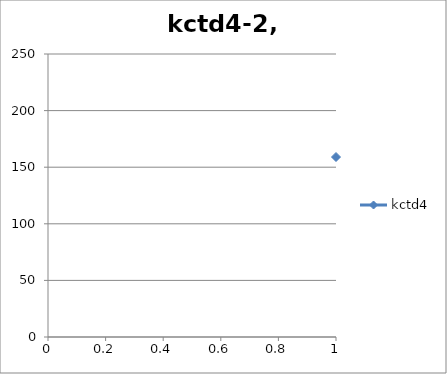
| Category | kctd4 |
|---|---|
| 0 | 159 |
| 1 | 196 |
| 2 | 106 |
| 3 | 56 |
| 4 | 29 |
| 5 | 74 |
| 6 | 39 |
| 7 | 24 |
| 8 | 20 |
| 9 | 11 |
| 10 | 2 |